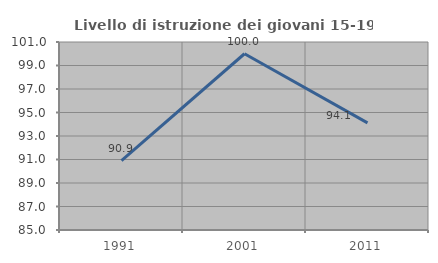
| Category | Livello di istruzione dei giovani 15-19 anni |
|---|---|
| 1991.0 | 90.909 |
| 2001.0 | 100 |
| 2011.0 | 94.118 |